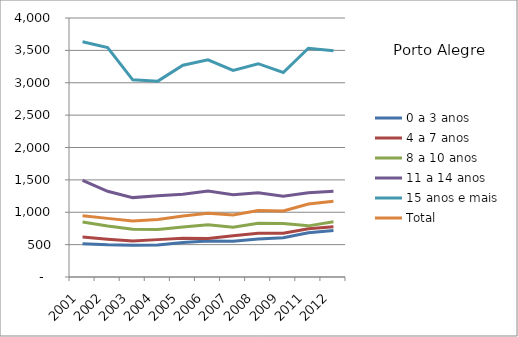
| Category | 0 a 3 anos | 4 a 7 anos | 8 a 10 anos | 11 a 14 anos | 15 anos e mais | Total |
|---|---|---|---|---|---|---|
| 2001.0 | 513.11 | 615.99 | 850.94 | 1492.07 | 3632.62 | 947.64 |
| 2002.0 | 497.74 | 582.96 | 788.93 | 1323.15 | 3542.5 | 905.51 |
| 2003.0 | 491.63 | 555.07 | 736.67 | 1225.94 | 3044.66 | 865.89 |
| 2004.0 | 494.25 | 577.23 | 732.79 | 1253.47 | 3024.92 | 887.61 |
| 2005.0 | 531 | 598.74 | 771.36 | 1277.02 | 3269.88 | 942.32 |
| 2006.0 | 555.62 | 596.48 | 805.89 | 1326.72 | 3354.43 | 985.83 |
| 2007.0 | 552.32 | 636.8 | 767.29 | 1270.48 | 3189.85 | 959.39 |
| 2008.0 | 585.29 | 675.59 | 829.06 | 1300.23 | 3294.19 | 1028.23 |
| 2009.0 | 607.45 | 675 | 825.81 | 1247.04 | 3157.7 | 1019.82 |
| 2011.0 | 683.41 | 745.62 | 789.76 | 1299.41 | 3533.25 | 1126.98 |
| 2012.0 | 719.39 | 777.16 | 853.51 | 1322.61 | 3495.22 | 1168.73 |